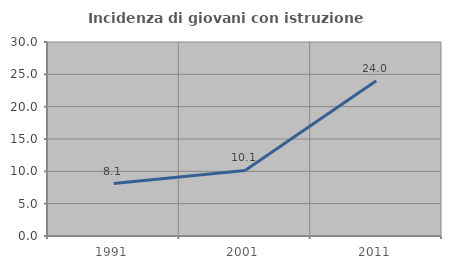
| Category | Incidenza di giovani con istruzione universitaria |
|---|---|
| 1991.0 | 8.103 |
| 2001.0 | 10.145 |
| 2011.0 | 23.992 |